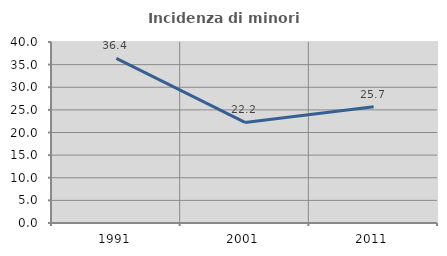
| Category | Incidenza di minori stranieri |
|---|---|
| 1991.0 | 36.364 |
| 2001.0 | 22.222 |
| 2011.0 | 25.67 |